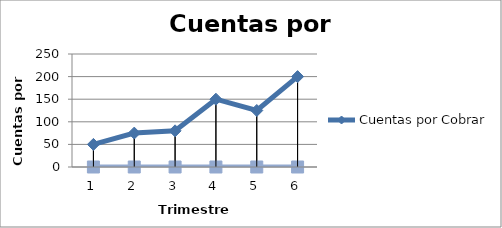
| Category | Trimestre | Cuentas por Cobrar  |
|---|---|---|
| 0 | 0 | 50 |
| 1 | 0 | 75 |
| 2 | 0 | 80 |
| 3 | 0 | 150 |
| 4 | 0 | 125 |
| 5 | 0 | 200 |